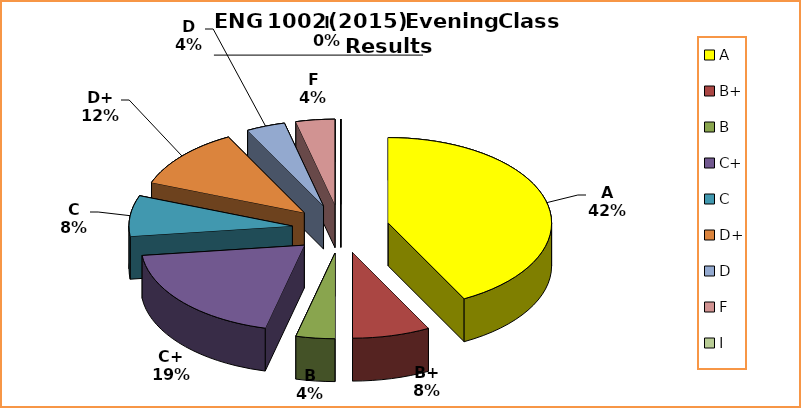
| Category | Series 0 |
|---|---|
| A | 11 |
| B+ | 2 |
| B | 1 |
| C+ | 5 |
| C | 2 |
| D+ | 3 |
| D | 1 |
| F | 1 |
| I | 0 |